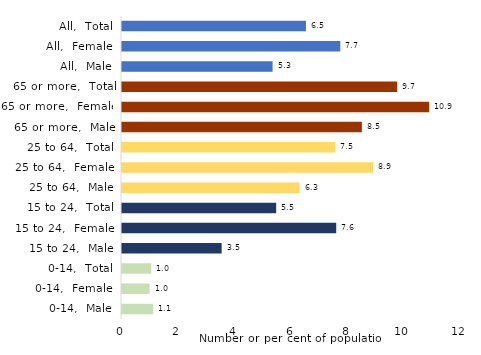
| Category | Series 0 |
|---|---|
| 0-14,  Male | 1.105 |
| 0-14,  Female | 0.977 |
| 0-14,  Total | 1.035 |
| 15 to 24,  Male | 3.527 |
| 15 to 24,  Female | 7.583 |
| 15 to 24,  Total | 5.458 |
| 25 to 64,  Male | 6.284 |
| 25 to 64,  Female | 8.886 |
| 25 to 64,  Total | 7.55 |
| 65 or more,  Male | 8.491 |
| 65 or more,  Female | 10.872 |
| 65 or more,  Total | 9.74 |
| All,  Male | 5.33 |
| All,  Female | 7.727 |
| All,  Total | 6.512 |